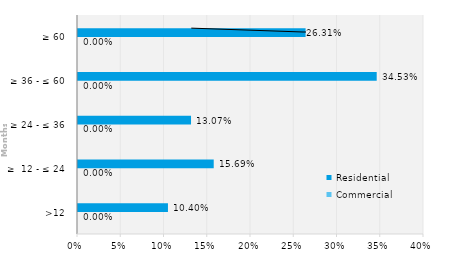
| Category | Commercial | Residential |
|---|---|---|
| >12 | 0 | 0.104 |
| ≥  12 - ≤ 24 | 0 | 0.157 |
| ≥ 24 - ≤ 36 | 0 | 0.131 |
| ≥ 36 - ≤ 60 | 0 | 0.345 |
| ≥ 60 | 0 | 0.263 |